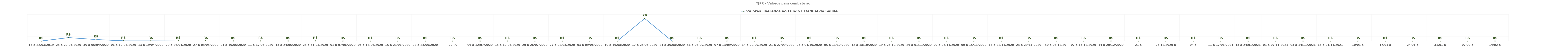
| Category | Valores liberados ao Fundo Estadual de Saúde |
|---|---|
| 16 a 22/03/2019 | 0 |
| 23 a 29/03/2020 | 15525475.73 |
| 30 a 05/04/2020 | 6781826.3 |
| 06 a 12/04/2020 | 962748.4 |
| 13 a 19/04/2020 | 815603.67 |
| 20 a 26/04/2020 | 621976.51 |
| 27 a 03/05/2020 | 657739.3 |
| 04 a 10/05/2020 | 324686.28 |
| 11 a 17/05/2020 | 341390.65 |
| 18 a 24/05/2020 | 259294.96 |
| 25 a 31/05/2020 | 469983.93 |
| 01 a 07/06/2020 | 28396.29 |
| 08 a 14/06/2020 | 32555.99 |
| 15 a 21/06/2020 | 18358.62 |
| 22 a 28/06/2020 | 43151.04 |
| 29  A 05/07/2020 | 63478.12 |
| 06 a 12/07/2020 | 74920.7 |
| 13 a 19/07/2020 | 196096.63 |
| 20 a 26/07/2020 | 2495.49 |
| 27 a 02/08/2020 | 15633.13 |
| 03 a 09/08/2020 | 0 |
| 10 a 16/08/2020 | 0 |
| 17 a 23/08/2020 | 101826305.19 |
| 24 a 30/08/2020 | 0 |
| 31 a 06/09/2020 | 0 |
| 07 a 13/09/2020 | 0 |
| 14 a 20/09/2020 | 0 |
| 21 a 27/09/2020 | 0 |
| 28 a 04/10/2020 | 0 |
| 05 a 11/10/2020 | 0 |
| 12 a 18/10/2020 | 0 |
| 19 a 25/10/2020 | 0 |
| 26 a 01/11/2020 | 0 |
| 02 a 08/11/2020 | 0 |
| 09 a 15/11/2020 | 0 |
| 16 a 22/11/2020 | 0 |
| 23 a 29/11/2020 | 0 |
| 30 a 06/12/20 | 0 |
| 07 a 13/12/2020 | 0 |
| 14 a 20/12/2020 | 0 |
| 21 a 27/12/2020* | 0 |
| 28/12/2020 a 03/01/2021* | 0 |
| 04 a 10/01/2021* | 0 |
| 11 a 17/01/2021 | 0 |
| 18 a 24/01/2021 | 0 |
| 01 a 07/11/2021 | 0 |
| 08 a 14/11/2021 | 0 |
| 15 a 21/11/2021 | 0 |
| 10/01 a 16/01/2022 | 0 |
| 17/01 a 23/01/2022 | 0 |
| 24/01 a 30/01/2022 | 0 |
| 31/01 a 06/02/2022 | 0 |
| 07/02 a 13/02/2022 | 0 |
| 14/02 a 20/02/2022 | 0 |